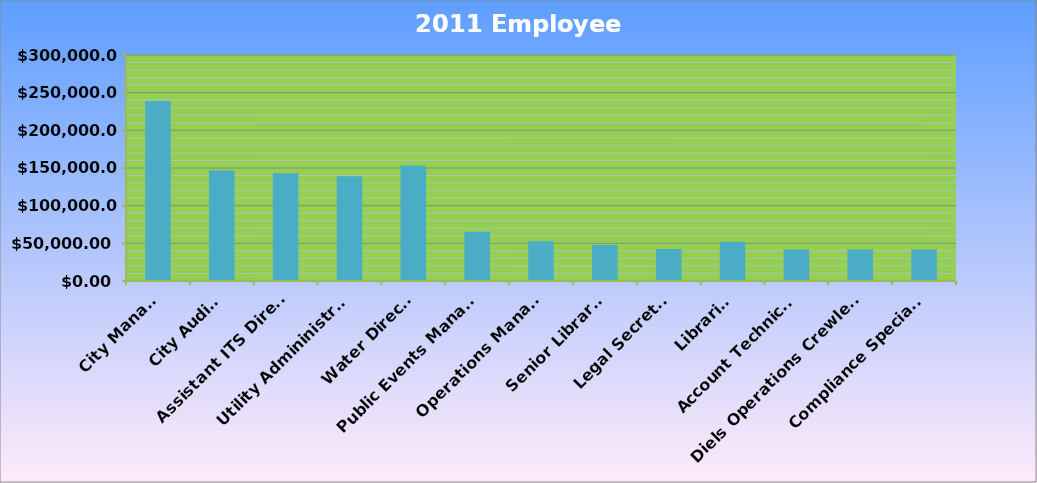
| Category | Series 0 |
|---|---|
| City Manager | 239057.725 |
| City Auditor | 146695.64 |
| Assistant ITS Director | 142877.595 |
| Utility Admininistrator | 139190.37 |
| Water Director | 153240.88 |
| Public Events Manager | 65418.44 |
| Operations Manager | 52862.885 |
| Senior Librarian | 47947.64 |
| Legal Secretary | 42505.95 |
| Librarian | 52241.28 |
| Account Technician | 41901.6 |
| Diels Operations Crewleader | 41879.76 |
| Compliance Specialist | 41771.6 |